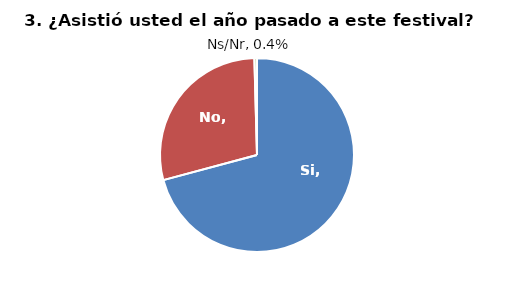
| Category | Series 0 |
|---|---|
| Si | 0.708 |
| No | 0.287 |
| Ns/Nr | 0.004 |